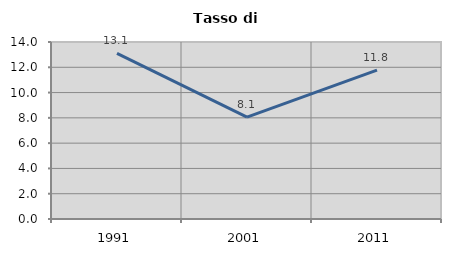
| Category | Tasso di disoccupazione   |
|---|---|
| 1991.0 | 13.095 |
| 2001.0 | 8.053 |
| 2011.0 | 11.769 |